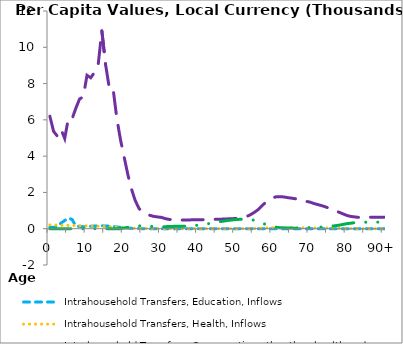
| Category | Intrahousehold Transfers, Education, Inflows | Intrahousehold Transfers, Health, Inflows | Intrahousehold Transfers, Consumption other than health and education, Inflows | Intrahousehold Transfers, Saving, Inflows |
|---|---|---|---|---|
| 0 | 90.048 | 211.609 | 6199.274 | 0 |
|  | 80.327 | 205.75 | 5369.056 | 0 |
| 2 | 102.394 | 199.891 | 5106.913 | 0 |
| 3 | 310.488 | 194.032 | 5481.733 | 0 |
| 4 | 452.202 | 188.402 | 4973.647 | 0 |
| 5 | 586.703 | 183.02 | 6109.78 | 0 |
| 6 | 507.653 | 177.886 | 6066.591 | 0 |
| 7 | 136.455 | 172.999 | 6644.314 | 0 |
| 8 | 129.698 | 168.511 | 7151.042 | 0 |
| 9 | 112.252 | 164.424 | 7265.624 | 0 |
| 10 | 124.074 | 159.12 | 8457.76 | 0 |
| 11 | 135.897 | 152.771 | 8320.221 | 0 |
| 12 | 146.372 | 146.522 | 8609.625 | 0 |
| 13 | 154.884 | 139.711 | 9021.332 | 0 |
| 14 | 159.044 | 129.857 | 10905.351 | 0 |
| 15 | 151.889 | 121.429 | 9057.431 | 0 |
| 16 | 140.581 | 111.674 | 7758.304 | 0 |
| 17 | 121.682 | 100.96 | 7756.349 | 0 |
| 18 | 96.732 | 90.407 | 6129.018 | 0 |
| 19 | 71.384 | 81.348 | 4918.157 | 2.145 |
| 20 | 50.915 | 66.834 | 3952.705 | 38.332 |
| 21 | 32.664 | 52.131 | 2978.783 | 74.518 |
| 22 | 19.374 | 37.644 | 2168.13 | 109.744 |
| 23 | 11.843 | 24.422 | 1544.039 | 134.935 |
| 24 | 7 | 13.382 | 1117.438 | 155.791 |
| 25 | 3.87 | 8.592 | 895.166 | 163.424 |
| 26 | 2.986 | 7.621 | 798.783 | 153.704 |
| 27 | 2.571 | 7.572 | 733.64 | 132.536 |
| 28 | 2.225 | 6.678 | 677.988 | 121.045 |
| 29 | 2.007 | 5.683 | 648.801 | 107.461 |
| 30 | 1.789 | 4.597 | 625.609 | 104.241 |
| 31 | 1.144 | 2.765 | 560.256 | 110.062 |
| 32 | 0.671 | 1.566 | 516.589 | 122.215 |
| 33 | 0.45 | 1.121 | 499.984 | 126.788 |
| 34 | 0.229 | 0.671 | 483.249 | 134.022 |
| 35 | 0.008 | 0.21 | 470.646 | 135.809 |
| 36 | 0 | 0.16 | 477.125 | 135.236 |
| 37 | 0 | 0.123 | 483.106 | 141.881 |
| 38 | 0 | 0.074 | 487.429 | 156.326 |
| 39 | 0 | 0.04 | 489.706 | 174.297 |
| 40 | 0 | 0.027 | 490.095 | 197.26 |
| 41 | 0 | 0.013 | 495.988 | 227.698 |
| 42 | 0 | 0 | 501.886 | 257.667 |
| 43 | 0 | 0 | 507.266 | 287.505 |
| 44 | 0 | 0 | 514.176 | 319.179 |
| 45 | 0 | 0 | 521.306 | 358.148 |
| 46 | 0 | 0 | 526.225 | 396.01 |
| 47 | 0 | 0 | 533.47 | 428.071 |
| 48 | 0.003 | 0 | 542.897 | 457.046 |
| 49 | 0.012 | 0 | 550.97 | 481.717 |
| 50 | 0.028 | 0 | 563.166 | 503.554 |
| 51 | 0.08 | 0.211 | 585.686 | 515.656 |
| 52 | 0.144 | 0.422 | 619.916 | 523.175 |
| 53 | 0.233 | 1.269 | 672.99 | 527.352 |
| 54 | 0.404 | 4.073 | 772.691 | 513.927 |
| 55 | 0.633 | 10.385 | 894.188 | 464.593 |
| 56 | 0.845 | 18.068 | 1040.97 | 403.956 |
| 57 | 1.149 | 30.439 | 1240.919 | 329.981 |
| 58 | 1.428 | 42.921 | 1434.477 | 241.929 |
| 59 | 1.577 | 53.144 | 1580.859 | 166.244 |
| 60 | 1.626 | 57.645 | 1689.225 | 112.923 |
| 61 | 1.653 | 60.707 | 1768.153 | 75.131 |
| 62 | 1.536 | 56.743 | 1766.636 | 53.684 |
| 63 | 1.412 | 52.743 | 1751.407 | 45.426 |
| 64 | 1.324 | 50.741 | 1714.332 | 38.902 |
| 65 | 1.239 | 51.013 | 1685.748 | 34.914 |
| 66 | 1.118 | 50.999 | 1655.758 | 30.086 |
| 67 | 1.007 | 52.454 | 1610.771 | 29.912 |
| 68 | 0.84 | 52.301 | 1549.906 | 34.588 |
| 69 | 0.646 | 47.836 | 1507.556 | 45.872 |
| 70 | 0.467 | 44.438 | 1469.476 | 58.243 |
| 71 | 0.324 | 41.141 | 1396.132 | 70.961 |
| 72 | 0.198 | 39.32 | 1337.583 | 79.83 |
| 73 | 0.126 | 37.91 | 1282.284 | 90.272 |
| 74 | 0.082 | 40.242 | 1218.108 | 97.92 |
| 75 | 0.052 | 39.024 | 1141.628 | 112.639 |
| 76 | 0.027 | 35.244 | 1061.128 | 141.864 |
| 77 | 0.013 | 29.766 | 973.935 | 170.359 |
| 78 | 0.005 | 24.469 | 897.231 | 198.98 |
| 79 | 0.001 | 16.257 | 811.912 | 241.577 |
| 80 | 0 | 10.198 | 728.078 | 279.082 |
| 81 | 0 | 6.541 | 678.979 | 303.427 |
| 82 | 0 | 3.837 | 651.491 | 330.168 |
| 83 | 0 | 1.369 | 626.698 | 353.165 |
| 84 | 0 | 0.689 | 622.916 | 357.955 |
| 85 | 0 | 0.278 | 628.711 | 359.068 |
| 86 | 0 | 0.071 | 632.788 | 360.274 |
| 87 | 0 | 0 | 635.149 | 360.341 |
| 88 | 0 | 0 | 636.262 | 361.114 |
| 89 | 0 | 0 | 636.517 | 364.434 |
| 90+ | 0 | 0 | 636.772 | 367.754 |